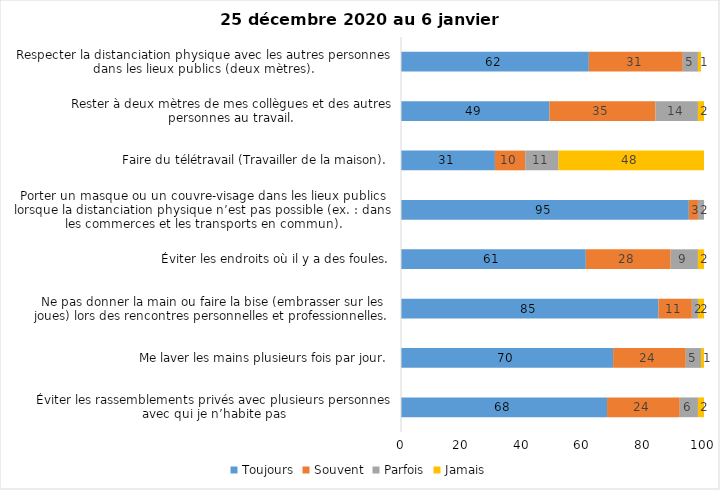
| Category | Toujours | Souvent | Parfois | Jamais |
|---|---|---|---|---|
| Éviter les rassemblements privés avec plusieurs personnes avec qui je n’habite pas | 68 | 24 | 6 | 2 |
| Me laver les mains plusieurs fois par jour. | 70 | 24 | 5 | 1 |
| Ne pas donner la main ou faire la bise (embrasser sur les joues) lors des rencontres personnelles et professionnelles. | 85 | 11 | 2 | 2 |
| Éviter les endroits où il y a des foules. | 61 | 28 | 9 | 2 |
| Porter un masque ou un couvre-visage dans les lieux publics lorsque la distanciation physique n’est pas possible (ex. : dans les commerces et les transports en commun). | 95 | 3 | 2 | 0 |
| Faire du télétravail (Travailler de la maison). | 31 | 10 | 11 | 48 |
| Rester à deux mètres de mes collègues et des autres personnes au travail. | 49 | 35 | 14 | 2 |
| Respecter la distanciation physique avec les autres personnes dans les lieux publics (deux mètres). | 62 | 31 | 5 | 1 |